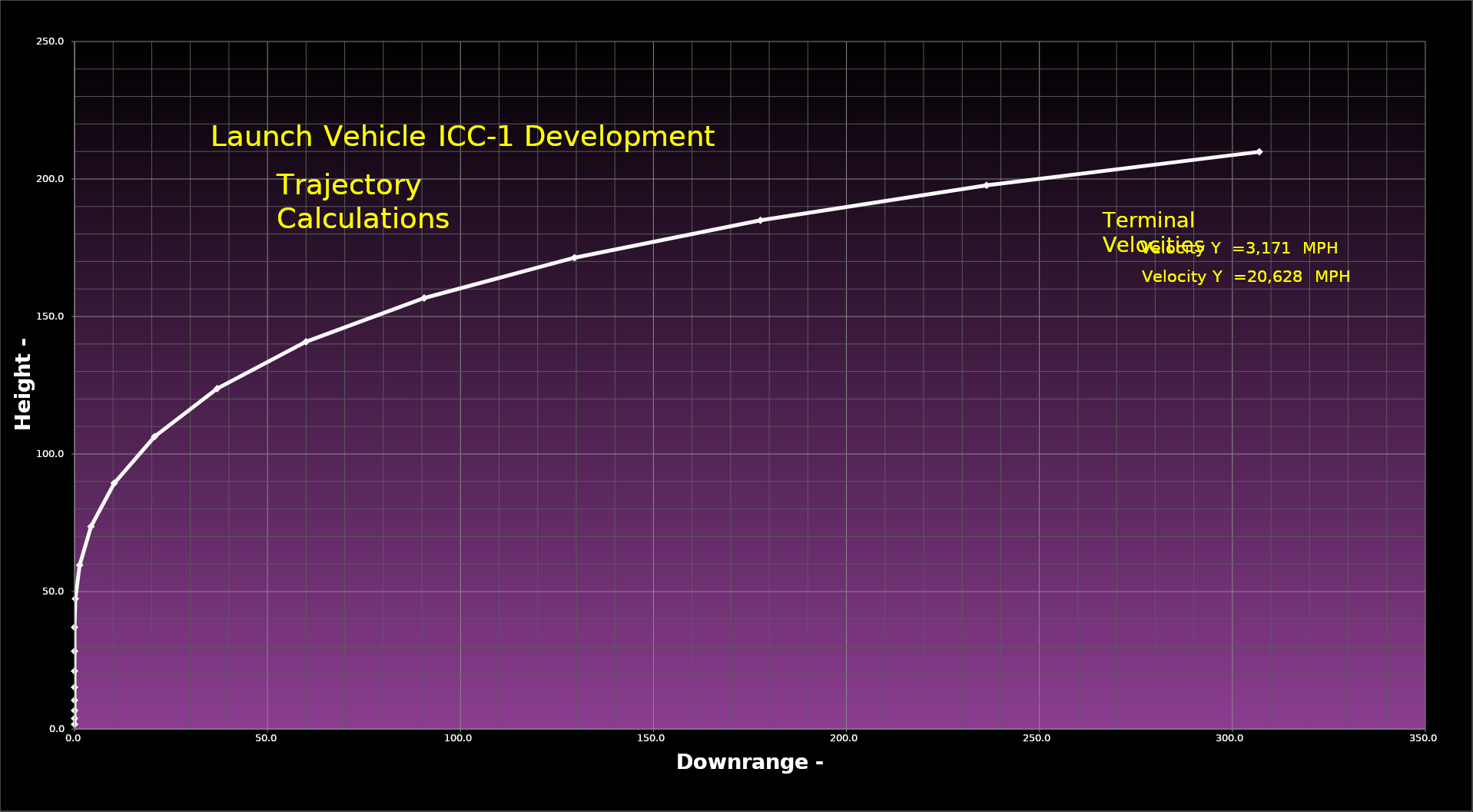
| Category | Series 0 |
|---|---|
| 0.0 | 1.709 |
| 4.2864948170828353e-16 | 3.851 |
| 9.76136048814617e-16 | 6.739 |
| 1.757828093546047e-15 | 10.468 |
| 2.7837827920420536e-15 | 15.187 |
| 4.064988580127997e-15 | 21.068 |
| 5.613409104228689e-15 | 28.284 |
| 7.442239085015767e-15 | 37.002 |
| 0.21534614521817677 | 47.393 |
| 1.321445987899453 | 59.588 |
| 4.271014678418183 | 73.632 |
| 10.278900473204748 | 89.36 |
| 20.75032933178853 | 106.32 |
| 36.96270656623157 | 123.794 |
| 59.97380984205271 | 140.815 |
| 90.58632659347953 | 156.706 |
| 129.5360260032638 | 171.383 |
| 177.71625245141186 | 184.981 |
| 236.30534345091098 | 197.701 |
| 306.9757733093496 | 209.878 |